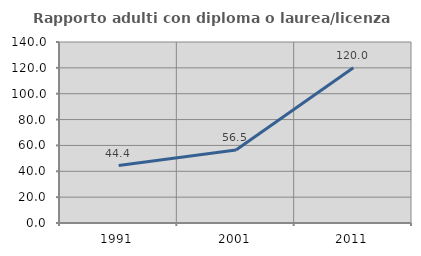
| Category | Rapporto adulti con diploma o laurea/licenza media  |
|---|---|
| 1991.0 | 44.444 |
| 2001.0 | 56.471 |
| 2011.0 | 120.024 |